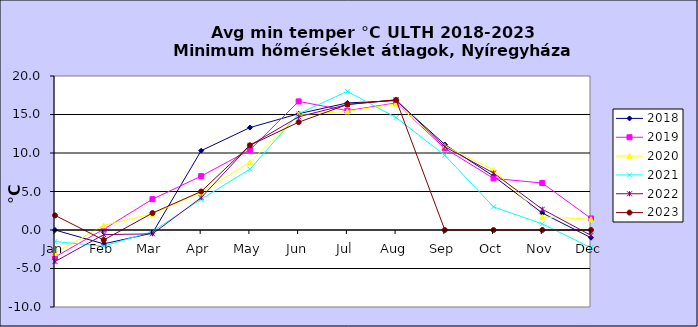
| Category | 2018 | 2019 | 2020 | 2021 | 2022 | 2023 |
|---|---|---|---|---|---|---|
| Jan | 0 | -3.5 | -3 | -1.5 | -4.1 | 1.9 |
| Feb | -1.8 | 0.1 | 0.6 | -2.1 | -0.6 | -1.3 |
| Mar | -0.4 | 4 | 2.1 | -0.2 | -0.5 | 2.2 |
| Apr | 10.3 | 7 | 4.9 | 4 | 4.2 | 5 |
| May | 13.3 | 10.4 | 8.8 | 7.9 | 11 | 11 |
| Jun | 15.1 | 16.7 | 15 | 15.1 | 14.7 | 14 |
| Jul | 16.5 | 15.5 | 15.4 | 18 | 16.3 | 16.3 |
| Aug | 16.8 | 16.5 | 16.4 | 14.6 | 16.9 | 16.9 |
| Sep | 11.1 | 10.6 | 10.9 | 9.7 | 10.8 | 0 |
| Oct | 7 | 6.7 | 7.8 | 3 | 7.4 | 0 |
| Nov | 2.2 | 6.1 | 1.7 | 0.8 | 2.7 | 0 |
| Dec | -1 | 1.5 | 1.4 | -2.3 | -0.7 | 0 |